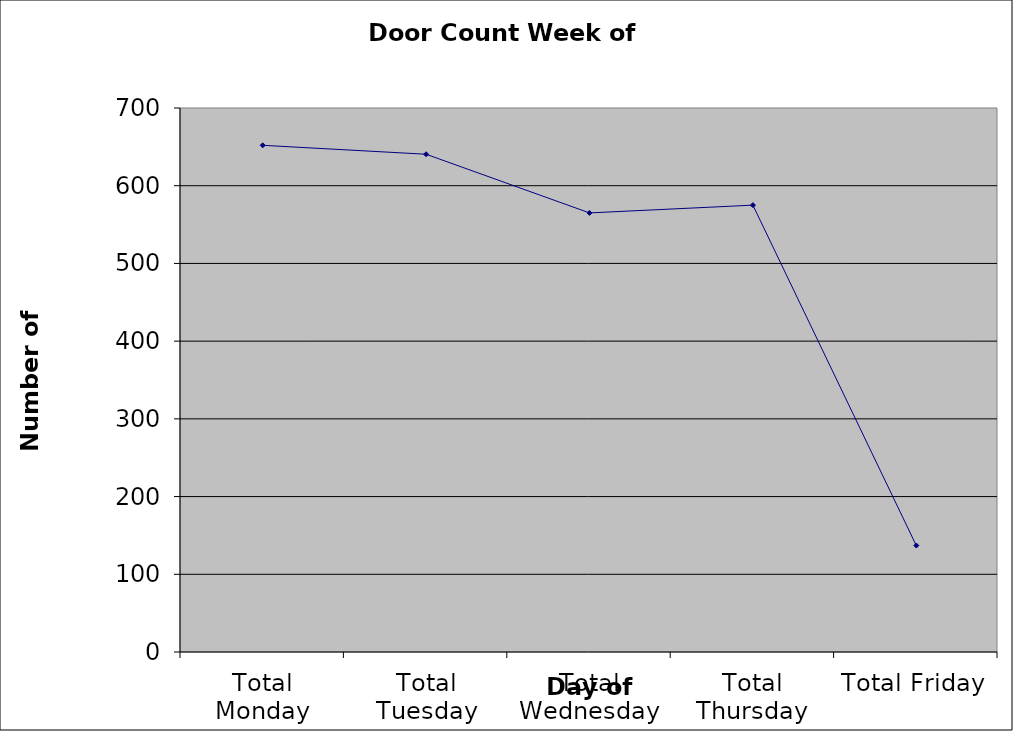
| Category | Series 0 |
|---|---|
| Total Monday | 652 |
| Total Tuesday | 640.5 |
| Total Wednesday | 565 |
| Total Thursday | 575 |
| Total Friday | 137 |